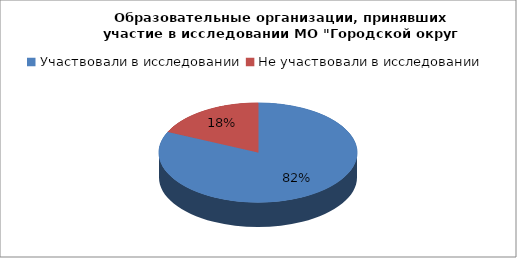
| Category | Series 0 |
|---|---|
| Участвовали в исследовании | 81.8 |
| Не участвовали в исследовании | 18.2 |